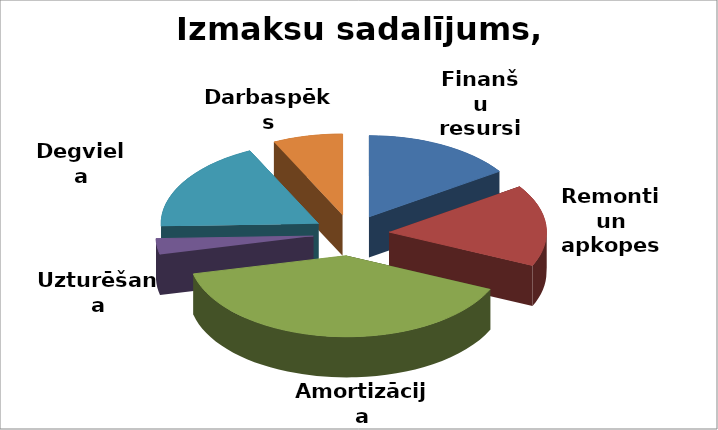
| Category | Series 0 |
|---|---|
| Finanšu resursi | 25.42 |
| Remonti un apkopes | 26.58 |
| Amortizācija | 64.89 |
| Uzturēšana | 5.11 |
| Degviela | 30 |
| Darbaspēks | 11.76 |